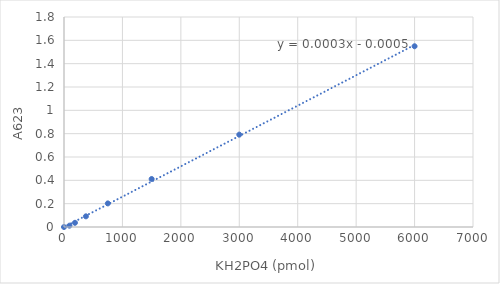
| Category | Series 0 |
|---|---|
| 0.0 | 0 |
| 93.75 | 0.011 |
| 187.5 | 0.036 |
| 375.0 | 0.091 |
| 750.0 | 0.202 |
| 1500.0 | 0.411 |
| 3000.0 | 0.792 |
| 6000.0 | 1.549 |